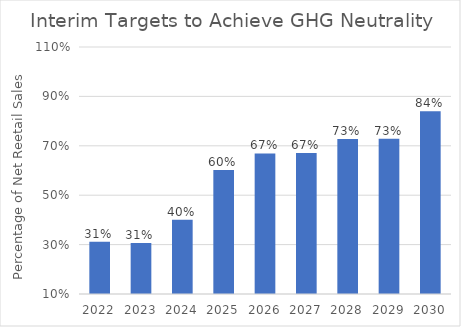
| Category | Percentage Clean Energy |
|---|---|
| 2022.0 | 0.312 |
| 2023.0 | 0.307 |
| 2024.0 | 0.4 |
| 2025.0 | 0.602 |
| 2026.0 | 0.669 |
| 2027.0 | 0.671 |
| 2028.0 | 0.728 |
| 2029.0 | 0.729 |
| 2030.0 | 0.84 |